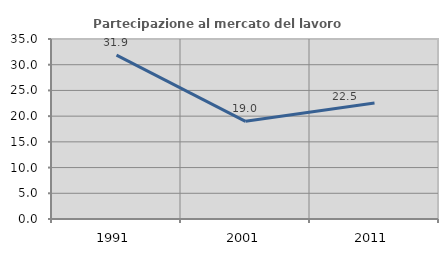
| Category | Partecipazione al mercato del lavoro  femminile |
|---|---|
| 1991.0 | 31.867 |
| 2001.0 | 18.994 |
| 2011.0 | 22.549 |